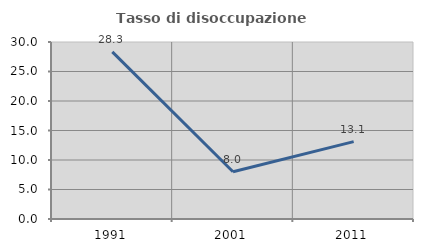
| Category | Tasso di disoccupazione giovanile  |
|---|---|
| 1991.0 | 28.319 |
| 2001.0 | 8 |
| 2011.0 | 13.115 |